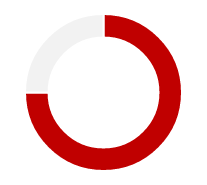
| Category | Series 0 |
|---|---|
| 0 | 0.75 |
| 1 | 0 |
| 2 | 0 |
| 3 | 0.25 |